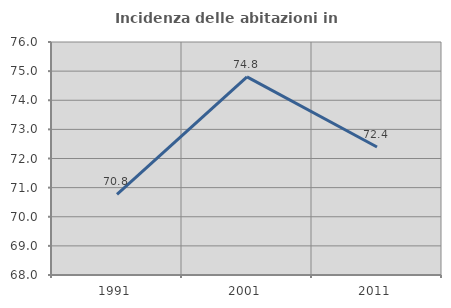
| Category | Incidenza delle abitazioni in proprietà  |
|---|---|
| 1991.0 | 70.77 |
| 2001.0 | 74.804 |
| 2011.0 | 72.396 |